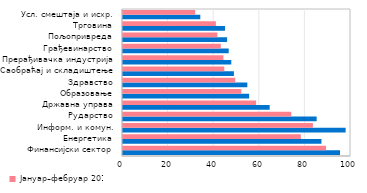
| Category | Јануар–фебруар 2019. | Јануар–фебруар 2018. |
|---|---|---|
| Финансијски сектор | 95.178 | 89.072 |
| Енергетика | 87.045 | 77.996 |
| Информ. и комун. | 97.64 | 83.283 |
| Рударство | 84.928 | 73.782 |
| Државна управа | 64.33 | 58.398 |
| Образовање | 55.33 | 51.884 |
| Здравство | 54.529 | 49.209 |
| Саобраћај и складиштење | 48.644 | 44.438 |
| Прерађивачка индустрија | 47.488 | 44.04 |
| Грађевинарство | 46.364 | 42.896 |
| Пољопривреда | 45.657 | 41.374 |
| Трговина | 44.744 | 40.738 |
| Усл. смештаја и исхр. | 33.906 | 31.642 |